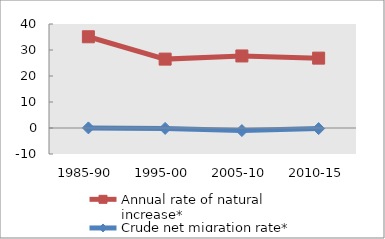
| Category | Annual rate of natural increase* | Crude net migration rate* |
|---|---|---|
| 1985-90 | 35.089 | 0.047 |
| 1995-00 | 26.495 | -0.146 |
| 2005-10 | 27.709 | -0.987 |
| 2010-15 | 26.874 | -0.228 |